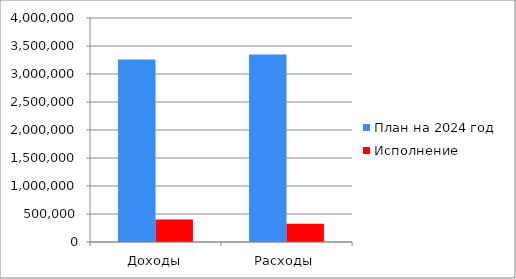
| Category | План на 2024 год | Исполнение |
|---|---|---|
| Доходы | 3258652.4 | 400548.5 |
| Расходы | 3348688.4 | 325099.5 |